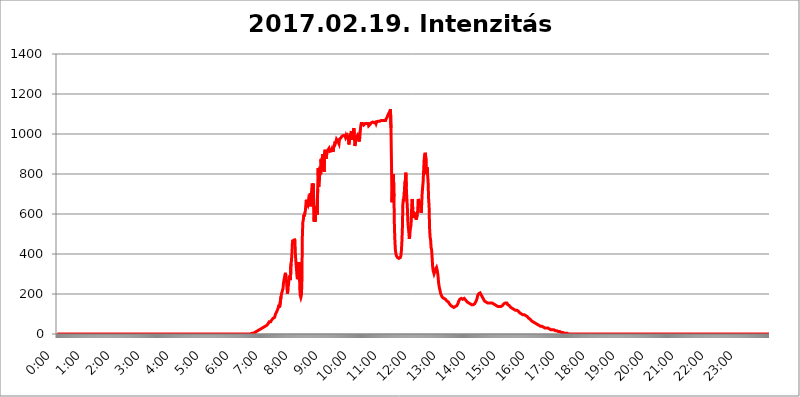
| Category | 2017.02.19. Intenzitás [W/m^2] |
|---|---|
| 0.0 | 0 |
| 0.0006944444444444445 | 0 |
| 0.001388888888888889 | 0 |
| 0.0020833333333333333 | 0 |
| 0.002777777777777778 | 0 |
| 0.003472222222222222 | 0 |
| 0.004166666666666667 | 0 |
| 0.004861111111111111 | 0 |
| 0.005555555555555556 | 0 |
| 0.0062499999999999995 | 0 |
| 0.006944444444444444 | 0 |
| 0.007638888888888889 | 0 |
| 0.008333333333333333 | 0 |
| 0.009027777777777779 | 0 |
| 0.009722222222222222 | 0 |
| 0.010416666666666666 | 0 |
| 0.011111111111111112 | 0 |
| 0.011805555555555555 | 0 |
| 0.012499999999999999 | 0 |
| 0.013194444444444444 | 0 |
| 0.013888888888888888 | 0 |
| 0.014583333333333332 | 0 |
| 0.015277777777777777 | 0 |
| 0.015972222222222224 | 0 |
| 0.016666666666666666 | 0 |
| 0.017361111111111112 | 0 |
| 0.018055555555555557 | 0 |
| 0.01875 | 0 |
| 0.019444444444444445 | 0 |
| 0.02013888888888889 | 0 |
| 0.020833333333333332 | 0 |
| 0.02152777777777778 | 0 |
| 0.022222222222222223 | 0 |
| 0.02291666666666667 | 0 |
| 0.02361111111111111 | 0 |
| 0.024305555555555556 | 0 |
| 0.024999999999999998 | 0 |
| 0.025694444444444447 | 0 |
| 0.02638888888888889 | 0 |
| 0.027083333333333334 | 0 |
| 0.027777777777777776 | 0 |
| 0.02847222222222222 | 0 |
| 0.029166666666666664 | 0 |
| 0.029861111111111113 | 0 |
| 0.030555555555555555 | 0 |
| 0.03125 | 0 |
| 0.03194444444444445 | 0 |
| 0.03263888888888889 | 0 |
| 0.03333333333333333 | 0 |
| 0.034027777777777775 | 0 |
| 0.034722222222222224 | 0 |
| 0.035416666666666666 | 0 |
| 0.036111111111111115 | 0 |
| 0.03680555555555556 | 0 |
| 0.0375 | 0 |
| 0.03819444444444444 | 0 |
| 0.03888888888888889 | 0 |
| 0.03958333333333333 | 0 |
| 0.04027777777777778 | 0 |
| 0.04097222222222222 | 0 |
| 0.041666666666666664 | 0 |
| 0.042361111111111106 | 0 |
| 0.04305555555555556 | 0 |
| 0.043750000000000004 | 0 |
| 0.044444444444444446 | 0 |
| 0.04513888888888889 | 0 |
| 0.04583333333333334 | 0 |
| 0.04652777777777778 | 0 |
| 0.04722222222222222 | 0 |
| 0.04791666666666666 | 0 |
| 0.04861111111111111 | 0 |
| 0.049305555555555554 | 0 |
| 0.049999999999999996 | 0 |
| 0.05069444444444445 | 0 |
| 0.051388888888888894 | 0 |
| 0.052083333333333336 | 0 |
| 0.05277777777777778 | 0 |
| 0.05347222222222222 | 0 |
| 0.05416666666666667 | 0 |
| 0.05486111111111111 | 0 |
| 0.05555555555555555 | 0 |
| 0.05625 | 0 |
| 0.05694444444444444 | 0 |
| 0.057638888888888885 | 0 |
| 0.05833333333333333 | 0 |
| 0.05902777777777778 | 0 |
| 0.059722222222222225 | 0 |
| 0.06041666666666667 | 0 |
| 0.061111111111111116 | 0 |
| 0.06180555555555556 | 0 |
| 0.0625 | 0 |
| 0.06319444444444444 | 0 |
| 0.06388888888888888 | 0 |
| 0.06458333333333334 | 0 |
| 0.06527777777777778 | 0 |
| 0.06597222222222222 | 0 |
| 0.06666666666666667 | 0 |
| 0.06736111111111111 | 0 |
| 0.06805555555555555 | 0 |
| 0.06874999999999999 | 0 |
| 0.06944444444444443 | 0 |
| 0.07013888888888889 | 0 |
| 0.07083333333333333 | 0 |
| 0.07152777777777779 | 0 |
| 0.07222222222222223 | 0 |
| 0.07291666666666667 | 0 |
| 0.07361111111111111 | 0 |
| 0.07430555555555556 | 0 |
| 0.075 | 0 |
| 0.07569444444444444 | 0 |
| 0.0763888888888889 | 0 |
| 0.07708333333333334 | 0 |
| 0.07777777777777778 | 0 |
| 0.07847222222222222 | 0 |
| 0.07916666666666666 | 0 |
| 0.0798611111111111 | 0 |
| 0.08055555555555556 | 0 |
| 0.08125 | 0 |
| 0.08194444444444444 | 0 |
| 0.08263888888888889 | 0 |
| 0.08333333333333333 | 0 |
| 0.08402777777777777 | 0 |
| 0.08472222222222221 | 0 |
| 0.08541666666666665 | 0 |
| 0.08611111111111112 | 0 |
| 0.08680555555555557 | 0 |
| 0.08750000000000001 | 0 |
| 0.08819444444444445 | 0 |
| 0.08888888888888889 | 0 |
| 0.08958333333333333 | 0 |
| 0.09027777777777778 | 0 |
| 0.09097222222222222 | 0 |
| 0.09166666666666667 | 0 |
| 0.09236111111111112 | 0 |
| 0.09305555555555556 | 0 |
| 0.09375 | 0 |
| 0.09444444444444444 | 0 |
| 0.09513888888888888 | 0 |
| 0.09583333333333333 | 0 |
| 0.09652777777777777 | 0 |
| 0.09722222222222222 | 0 |
| 0.09791666666666667 | 0 |
| 0.09861111111111111 | 0 |
| 0.09930555555555555 | 0 |
| 0.09999999999999999 | 0 |
| 0.10069444444444443 | 0 |
| 0.1013888888888889 | 0 |
| 0.10208333333333335 | 0 |
| 0.10277777777777779 | 0 |
| 0.10347222222222223 | 0 |
| 0.10416666666666667 | 0 |
| 0.10486111111111111 | 0 |
| 0.10555555555555556 | 0 |
| 0.10625 | 0 |
| 0.10694444444444444 | 0 |
| 0.1076388888888889 | 0 |
| 0.10833333333333334 | 0 |
| 0.10902777777777778 | 0 |
| 0.10972222222222222 | 0 |
| 0.1111111111111111 | 0 |
| 0.11180555555555556 | 0 |
| 0.11180555555555556 | 0 |
| 0.1125 | 0 |
| 0.11319444444444444 | 0 |
| 0.11388888888888889 | 0 |
| 0.11458333333333333 | 0 |
| 0.11527777777777777 | 0 |
| 0.11597222222222221 | 0 |
| 0.11666666666666665 | 0 |
| 0.1173611111111111 | 0 |
| 0.11805555555555557 | 0 |
| 0.11944444444444445 | 0 |
| 0.12013888888888889 | 0 |
| 0.12083333333333333 | 0 |
| 0.12152777777777778 | 0 |
| 0.12222222222222223 | 0 |
| 0.12291666666666667 | 0 |
| 0.12291666666666667 | 0 |
| 0.12361111111111112 | 0 |
| 0.12430555555555556 | 0 |
| 0.125 | 0 |
| 0.12569444444444444 | 0 |
| 0.12638888888888888 | 0 |
| 0.12708333333333333 | 0 |
| 0.16875 | 0 |
| 0.12847222222222224 | 0 |
| 0.12916666666666668 | 0 |
| 0.12986111111111112 | 0 |
| 0.13055555555555556 | 0 |
| 0.13125 | 0 |
| 0.13194444444444445 | 0 |
| 0.1326388888888889 | 0 |
| 0.13333333333333333 | 0 |
| 0.13402777777777777 | 0 |
| 0.13402777777777777 | 0 |
| 0.13472222222222222 | 0 |
| 0.13541666666666666 | 0 |
| 0.1361111111111111 | 0 |
| 0.13749999999999998 | 0 |
| 0.13819444444444443 | 0 |
| 0.1388888888888889 | 0 |
| 0.13958333333333334 | 0 |
| 0.14027777777777778 | 0 |
| 0.14097222222222222 | 0 |
| 0.14166666666666666 | 0 |
| 0.1423611111111111 | 0 |
| 0.14305555555555557 | 0 |
| 0.14375000000000002 | 0 |
| 0.14444444444444446 | 0 |
| 0.1451388888888889 | 0 |
| 0.1451388888888889 | 0 |
| 0.14652777777777778 | 0 |
| 0.14722222222222223 | 0 |
| 0.14791666666666667 | 0 |
| 0.1486111111111111 | 0 |
| 0.14930555555555555 | 0 |
| 0.15 | 0 |
| 0.15069444444444444 | 0 |
| 0.15138888888888888 | 0 |
| 0.15208333333333332 | 0 |
| 0.15277777777777776 | 0 |
| 0.15347222222222223 | 0 |
| 0.15416666666666667 | 0 |
| 0.15486111111111112 | 0 |
| 0.15555555555555556 | 0 |
| 0.15625 | 0 |
| 0.15694444444444444 | 0 |
| 0.15763888888888888 | 0 |
| 0.15833333333333333 | 0 |
| 0.15902777777777777 | 0 |
| 0.15972222222222224 | 0 |
| 0.16041666666666668 | 0 |
| 0.16111111111111112 | 0 |
| 0.16180555555555556 | 0 |
| 0.1625 | 0 |
| 0.16319444444444445 | 0 |
| 0.1638888888888889 | 0 |
| 0.16458333333333333 | 0 |
| 0.16527777777777777 | 0 |
| 0.16597222222222222 | 0 |
| 0.16666666666666666 | 0 |
| 0.1673611111111111 | 0 |
| 0.16805555555555554 | 0 |
| 0.16874999999999998 | 0 |
| 0.16944444444444443 | 0 |
| 0.17013888888888887 | 0 |
| 0.1708333333333333 | 0 |
| 0.17152777777777775 | 0 |
| 0.17222222222222225 | 0 |
| 0.1729166666666667 | 0 |
| 0.17361111111111113 | 0 |
| 0.17430555555555557 | 0 |
| 0.17500000000000002 | 0 |
| 0.17569444444444446 | 0 |
| 0.1763888888888889 | 0 |
| 0.17708333333333334 | 0 |
| 0.17777777777777778 | 0 |
| 0.17847222222222223 | 0 |
| 0.17916666666666667 | 0 |
| 0.1798611111111111 | 0 |
| 0.18055555555555555 | 0 |
| 0.18125 | 0 |
| 0.18194444444444444 | 0 |
| 0.1826388888888889 | 0 |
| 0.18333333333333335 | 0 |
| 0.1840277777777778 | 0 |
| 0.18472222222222223 | 0 |
| 0.18541666666666667 | 0 |
| 0.18611111111111112 | 0 |
| 0.18680555555555556 | 0 |
| 0.1875 | 0 |
| 0.18819444444444444 | 0 |
| 0.18888888888888888 | 0 |
| 0.18958333333333333 | 0 |
| 0.19027777777777777 | 0 |
| 0.1909722222222222 | 0 |
| 0.19166666666666665 | 0 |
| 0.19236111111111112 | 0 |
| 0.19305555555555554 | 0 |
| 0.19375 | 0 |
| 0.19444444444444445 | 0 |
| 0.1951388888888889 | 0 |
| 0.19583333333333333 | 0 |
| 0.19652777777777777 | 0 |
| 0.19722222222222222 | 0 |
| 0.19791666666666666 | 0 |
| 0.1986111111111111 | 0 |
| 0.19930555555555554 | 0 |
| 0.19999999999999998 | 0 |
| 0.20069444444444443 | 0 |
| 0.20138888888888887 | 0 |
| 0.2020833333333333 | 0 |
| 0.2027777777777778 | 0 |
| 0.2034722222222222 | 0 |
| 0.2041666666666667 | 0 |
| 0.20486111111111113 | 0 |
| 0.20555555555555557 | 0 |
| 0.20625000000000002 | 0 |
| 0.20694444444444446 | 0 |
| 0.2076388888888889 | 0 |
| 0.20833333333333334 | 0 |
| 0.20902777777777778 | 0 |
| 0.20972222222222223 | 0 |
| 0.21041666666666667 | 0 |
| 0.2111111111111111 | 0 |
| 0.21180555555555555 | 0 |
| 0.2125 | 0 |
| 0.21319444444444444 | 0 |
| 0.2138888888888889 | 0 |
| 0.21458333333333335 | 0 |
| 0.2152777777777778 | 0 |
| 0.21597222222222223 | 0 |
| 0.21666666666666667 | 0 |
| 0.21736111111111112 | 0 |
| 0.21805555555555556 | 0 |
| 0.21875 | 0 |
| 0.21944444444444444 | 0 |
| 0.22013888888888888 | 0 |
| 0.22083333333333333 | 0 |
| 0.22152777777777777 | 0 |
| 0.2222222222222222 | 0 |
| 0.22291666666666665 | 0 |
| 0.2236111111111111 | 0 |
| 0.22430555555555556 | 0 |
| 0.225 | 0 |
| 0.22569444444444445 | 0 |
| 0.2263888888888889 | 0 |
| 0.22708333333333333 | 0 |
| 0.22777777777777777 | 0 |
| 0.22847222222222222 | 0 |
| 0.22916666666666666 | 0 |
| 0.2298611111111111 | 0 |
| 0.23055555555555554 | 0 |
| 0.23124999999999998 | 0 |
| 0.23194444444444443 | 0 |
| 0.23263888888888887 | 0 |
| 0.2333333333333333 | 0 |
| 0.2340277777777778 | 0 |
| 0.2347222222222222 | 0 |
| 0.2354166666666667 | 0 |
| 0.23611111111111113 | 0 |
| 0.23680555555555557 | 0 |
| 0.23750000000000002 | 0 |
| 0.23819444444444446 | 0 |
| 0.2388888888888889 | 0 |
| 0.23958333333333334 | 0 |
| 0.24027777777777778 | 0 |
| 0.24097222222222223 | 0 |
| 0.24166666666666667 | 0 |
| 0.2423611111111111 | 0 |
| 0.24305555555555555 | 0 |
| 0.24375 | 0 |
| 0.24444444444444446 | 0 |
| 0.24513888888888888 | 0 |
| 0.24583333333333335 | 0 |
| 0.2465277777777778 | 0 |
| 0.24722222222222223 | 0 |
| 0.24791666666666667 | 0 |
| 0.24861111111111112 | 0 |
| 0.24930555555555556 | 0 |
| 0.25 | 0 |
| 0.25069444444444444 | 0 |
| 0.2513888888888889 | 0 |
| 0.2520833333333333 | 0 |
| 0.25277777777777777 | 0 |
| 0.2534722222222222 | 0 |
| 0.25416666666666665 | 0 |
| 0.2548611111111111 | 0 |
| 0.2555555555555556 | 0 |
| 0.25625000000000003 | 0 |
| 0.2569444444444445 | 0 |
| 0.2576388888888889 | 0 |
| 0.25833333333333336 | 0 |
| 0.2590277777777778 | 0 |
| 0.25972222222222224 | 0 |
| 0.2604166666666667 | 0 |
| 0.2611111111111111 | 0 |
| 0.26180555555555557 | 0 |
| 0.2625 | 0 |
| 0.26319444444444445 | 0 |
| 0.2638888888888889 | 0 |
| 0.26458333333333334 | 0 |
| 0.2652777777777778 | 0 |
| 0.2659722222222222 | 0 |
| 0.26666666666666666 | 0 |
| 0.2673611111111111 | 0 |
| 0.26805555555555555 | 0 |
| 0.26875 | 0 |
| 0.26944444444444443 | 0 |
| 0.2701388888888889 | 0 |
| 0.2708333333333333 | 0 |
| 0.27152777777777776 | 0 |
| 0.2722222222222222 | 3.525 |
| 0.27291666666666664 | 3.525 |
| 0.2736111111111111 | 3.525 |
| 0.2743055555555555 | 3.525 |
| 0.27499999999999997 | 3.525 |
| 0.27569444444444446 | 7.887 |
| 0.27638888888888885 | 7.887 |
| 0.27708333333333335 | 7.887 |
| 0.2777777777777778 | 7.887 |
| 0.27847222222222223 | 12.257 |
| 0.2791666666666667 | 12.257 |
| 0.2798611111111111 | 12.257 |
| 0.28055555555555556 | 16.636 |
| 0.28125 | 16.636 |
| 0.28194444444444444 | 16.636 |
| 0.2826388888888889 | 16.636 |
| 0.2833333333333333 | 21.024 |
| 0.28402777777777777 | 21.024 |
| 0.2847222222222222 | 21.024 |
| 0.28541666666666665 | 25.419 |
| 0.28611111111111115 | 25.419 |
| 0.28680555555555554 | 25.419 |
| 0.28750000000000003 | 29.823 |
| 0.2881944444444445 | 29.823 |
| 0.2888888888888889 | 29.823 |
| 0.28958333333333336 | 34.234 |
| 0.2902777777777778 | 34.234 |
| 0.29097222222222224 | 38.653 |
| 0.2916666666666667 | 38.653 |
| 0.2923611111111111 | 38.653 |
| 0.29305555555555557 | 43.079 |
| 0.29375 | 43.079 |
| 0.29444444444444445 | 47.511 |
| 0.2951388888888889 | 47.511 |
| 0.29583333333333334 | 51.951 |
| 0.2965277777777778 | 56.398 |
| 0.2972222222222222 | 60.85 |
| 0.29791666666666666 | 60.85 |
| 0.2986111111111111 | 60.85 |
| 0.29930555555555555 | 60.85 |
| 0.3 | 65.31 |
| 0.30069444444444443 | 69.775 |
| 0.3013888888888889 | 74.246 |
| 0.3020833333333333 | 74.246 |
| 0.30277777777777776 | 78.722 |
| 0.3034722222222222 | 78.722 |
| 0.30416666666666664 | 83.205 |
| 0.3048611111111111 | 83.205 |
| 0.3055555555555555 | 92.184 |
| 0.30624999999999997 | 101.184 |
| 0.3069444444444444 | 101.184 |
| 0.3076388888888889 | 110.201 |
| 0.30833333333333335 | 114.716 |
| 0.3090277777777778 | 114.716 |
| 0.30972222222222223 | 128.284 |
| 0.3104166666666667 | 137.347 |
| 0.3111111111111111 | 146.423 |
| 0.31180555555555556 | 132.814 |
| 0.3125 | 128.284 |
| 0.31319444444444444 | 137.347 |
| 0.3138888888888889 | 187.378 |
| 0.3145833333333333 | 201.058 |
| 0.31527777777777777 | 201.058 |
| 0.3159722222222222 | 201.058 |
| 0.31666666666666665 | 228.436 |
| 0.31736111111111115 | 255.813 |
| 0.31805555555555554 | 269.49 |
| 0.31875000000000003 | 283.156 |
| 0.3194444444444445 | 296.808 |
| 0.3201388888888889 | 305.898 |
| 0.32083333333333336 | 278.603 |
| 0.3215277777777778 | 269.49 |
| 0.32222222222222224 | 228.436 |
| 0.3229166666666667 | 201.058 |
| 0.3236111111111111 | 228.436 |
| 0.32430555555555557 | 246.689 |
| 0.325 | 269.49 |
| 0.32569444444444445 | 292.259 |
| 0.3263888888888889 | 278.603 |
| 0.32708333333333334 | 269.49 |
| 0.3277777777777778 | 351.198 |
| 0.3284722222222222 | 364.728 |
| 0.32916666666666666 | 405.108 |
| 0.3298611111111111 | 458.38 |
| 0.33055555555555555 | 471.582 |
| 0.33125 | 471.582 |
| 0.33194444444444443 | 445.129 |
| 0.3326388888888889 | 475.972 |
| 0.3333333333333333 | 467.187 |
| 0.3340277777777778 | 396.164 |
| 0.3347222222222222 | 360.221 |
| 0.3354166666666667 | 355.712 |
| 0.3361111111111111 | 296.808 |
| 0.3368055555555556 | 274.047 |
| 0.33749999999999997 | 278.603 |
| 0.33819444444444446 | 324.052 |
| 0.33888888888888885 | 360.221 |
| 0.33958333333333335 | 305.898 |
| 0.34027777777777773 | 219.309 |
| 0.34097222222222223 | 191.937 |
| 0.3416666666666666 | 182.82 |
| 0.3423611111111111 | 191.937 |
| 0.3430555555555555 | 246.689 |
| 0.34375 | 484.735 |
| 0.3444444444444445 | 558.261 |
| 0.3451388888888889 | 571.049 |
| 0.3458333333333334 | 596.45 |
| 0.34652777777777777 | 588.009 |
| 0.34722222222222227 | 604.864 |
| 0.34791666666666665 | 613.252 |
| 0.34861111111111115 | 642.4 |
| 0.34930555555555554 | 671.22 |
| 0.35000000000000003 | 650.667 |
| 0.3506944444444444 | 650.667 |
| 0.3513888888888889 | 642.4 |
| 0.3520833333333333 | 658.909 |
| 0.3527777777777778 | 679.395 |
| 0.3534722222222222 | 683.473 |
| 0.3541666666666667 | 671.22 |
| 0.3548611111111111 | 703.762 |
| 0.35555555555555557 | 638.256 |
| 0.35625 | 687.544 |
| 0.35694444444444445 | 723.889 |
| 0.3576388888888889 | 751.803 |
| 0.35833333333333334 | 735.89 |
| 0.3590277777777778 | 751.803 |
| 0.3597222222222222 | 755.766 |
| 0.36041666666666666 | 562.53 |
| 0.3611111111111111 | 638.256 |
| 0.36180555555555555 | 562.53 |
| 0.3625 | 625.784 |
| 0.36319444444444443 | 634.105 |
| 0.3638888888888889 | 634.105 |
| 0.3645833333333333 | 596.45 |
| 0.3652777777777778 | 723.889 |
| 0.3659722222222222 | 829.981 |
| 0.3666666666666667 | 735.89 |
| 0.3673611111111111 | 739.877 |
| 0.3680555555555556 | 795.074 |
| 0.36874999999999997 | 837.682 |
| 0.36944444444444446 | 798.974 |
| 0.37013888888888885 | 875.918 |
| 0.37083333333333335 | 837.682 |
| 0.37152777777777773 | 872.114 |
| 0.37222222222222223 | 898.668 |
| 0.3729166666666666 | 872.114 |
| 0.3736111111111111 | 818.392 |
| 0.3743055555555555 | 810.641 |
| 0.375 | 906.223 |
| 0.3756944444444445 | 921.298 |
| 0.3763888888888889 | 898.668 |
| 0.3770833333333334 | 875.918 |
| 0.37777777777777777 | 879.719 |
| 0.37847222222222227 | 913.766 |
| 0.37916666666666665 | 913.766 |
| 0.37986111111111115 | 921.298 |
| 0.38055555555555554 | 921.298 |
| 0.38125000000000003 | 928.819 |
| 0.3819444444444444 | 925.06 |
| 0.3826388888888889 | 913.766 |
| 0.3833333333333333 | 917.534 |
| 0.3840277777777778 | 909.996 |
| 0.3847222222222222 | 917.534 |
| 0.3854166666666667 | 925.06 |
| 0.3861111111111111 | 921.298 |
| 0.38680555555555557 | 909.996 |
| 0.3875 | 932.576 |
| 0.38819444444444445 | 940.082 |
| 0.3888888888888889 | 947.58 |
| 0.38958333333333334 | 962.555 |
| 0.3902777777777778 | 955.071 |
| 0.3909722222222222 | 962.555 |
| 0.39166666666666666 | 973.772 |
| 0.3923611111111111 | 970.034 |
| 0.39305555555555555 | 970.034 |
| 0.39375 | 962.555 |
| 0.39444444444444443 | 958.814 |
| 0.3951388888888889 | 951.327 |
| 0.3958333333333333 | 973.772 |
| 0.3965277777777778 | 973.772 |
| 0.3972222222222222 | 977.508 |
| 0.3979166666666667 | 981.244 |
| 0.3986111111111111 | 984.98 |
| 0.3993055555555556 | 988.714 |
| 0.39999999999999997 | 984.98 |
| 0.40069444444444446 | 992.448 |
| 0.40138888888888885 | 992.448 |
| 0.40208333333333335 | 992.448 |
| 0.40277777777777773 | 992.448 |
| 0.40347222222222223 | 992.448 |
| 0.4041666666666666 | 984.98 |
| 0.4048611111111111 | 992.448 |
| 0.4055555555555555 | 984.98 |
| 0.40625 | 984.98 |
| 0.4069444444444445 | 992.448 |
| 0.4076388888888889 | 984.98 |
| 0.4083333333333334 | 973.772 |
| 0.40902777777777777 | 947.58 |
| 0.40972222222222227 | 966.295 |
| 0.41041666666666665 | 984.98 |
| 0.41111111111111115 | 1003.65 |
| 0.41180555555555554 | 992.448 |
| 0.41250000000000003 | 1014.852 |
| 0.4131944444444444 | 992.448 |
| 0.4138888888888889 | 1014.852 |
| 0.4145833333333333 | 970.034 |
| 0.4152777777777778 | 1014.852 |
| 0.4159722222222222 | 1029.798 |
| 0.4166666666666667 | 999.916 |
| 0.4173611111111111 | 940.082 |
| 0.41805555555555557 | 943.832 |
| 0.41875 | 966.295 |
| 0.41944444444444445 | 973.772 |
| 0.4201388888888889 | 988.714 |
| 0.42083333333333334 | 988.714 |
| 0.4215277777777778 | 996.182 |
| 0.4222222222222222 | 988.714 |
| 0.42291666666666666 | 977.508 |
| 0.4236111111111111 | 962.555 |
| 0.42430555555555555 | 984.98 |
| 0.425 | 1014.852 |
| 0.42569444444444443 | 1041.019 |
| 0.4263888888888889 | 1052.255 |
| 0.4270833333333333 | 1048.508 |
| 0.4277777777777778 | 1048.508 |
| 0.4284722222222222 | 1052.255 |
| 0.4291666666666667 | 1048.508 |
| 0.4298611111111111 | 1044.762 |
| 0.4305555555555556 | 1048.508 |
| 0.43124999999999997 | 1048.508 |
| 0.43194444444444446 | 1052.255 |
| 0.43263888888888885 | 1052.255 |
| 0.43333333333333335 | 1052.255 |
| 0.43402777777777773 | 1052.255 |
| 0.43472222222222223 | 1056.004 |
| 0.4354166666666666 | 1052.255 |
| 0.4361111111111111 | 1052.255 |
| 0.4368055555555555 | 1041.019 |
| 0.4375 | 1041.019 |
| 0.4381944444444445 | 1041.019 |
| 0.4388888888888889 | 1048.508 |
| 0.4395833333333334 | 1052.255 |
| 0.44027777777777777 | 1056.004 |
| 0.44097222222222227 | 1056.004 |
| 0.44166666666666665 | 1056.004 |
| 0.44236111111111115 | 1059.756 |
| 0.44305555555555554 | 1059.756 |
| 0.44375000000000003 | 1056.004 |
| 0.4444444444444444 | 1056.004 |
| 0.4451388888888889 | 1056.004 |
| 0.4458333333333333 | 1059.756 |
| 0.4465277777777778 | 1059.756 |
| 0.4472222222222222 | 1052.255 |
| 0.4479166666666667 | 1059.756 |
| 0.4486111111111111 | 1063.51 |
| 0.44930555555555557 | 1059.756 |
| 0.45 | 1063.51 |
| 0.45069444444444445 | 1059.756 |
| 0.4513888888888889 | 1063.51 |
| 0.45208333333333334 | 1063.51 |
| 0.4527777777777778 | 1063.51 |
| 0.4534722222222222 | 1067.267 |
| 0.45416666666666666 | 1067.267 |
| 0.4548611111111111 | 1067.267 |
| 0.45555555555555555 | 1063.51 |
| 0.45625 | 1067.267 |
| 0.45694444444444443 | 1067.267 |
| 0.4576388888888889 | 1067.267 |
| 0.4583333333333333 | 1067.267 |
| 0.4590277777777778 | 1067.267 |
| 0.4597222222222222 | 1063.51 |
| 0.4604166666666667 | 1067.267 |
| 0.4611111111111111 | 1074.789 |
| 0.4618055555555556 | 1078.555 |
| 0.46249999999999997 | 1082.324 |
| 0.46319444444444446 | 1089.873 |
| 0.46388888888888885 | 1093.653 |
| 0.46458333333333335 | 1101.226 |
| 0.46527777777777773 | 1101.226 |
| 0.46597222222222223 | 1108.816 |
| 0.4666666666666666 | 1116.426 |
| 0.4673611111111111 | 1124.056 |
| 0.4680555555555555 | 1029.798 |
| 0.46875 | 864.493 |
| 0.4694444444444445 | 658.909 |
| 0.4701388888888889 | 723.889 |
| 0.4708333333333334 | 715.858 |
| 0.47152777777777777 | 798.974 |
| 0.47222222222222227 | 687.544 |
| 0.47291666666666665 | 532.513 |
| 0.47361111111111115 | 462.786 |
| 0.47430555555555554 | 418.492 |
| 0.47500000000000003 | 400.638 |
| 0.4756944444444444 | 391.685 |
| 0.4763888888888889 | 387.202 |
| 0.4770833333333333 | 382.715 |
| 0.4777777777777778 | 378.224 |
| 0.4784722222222222 | 378.224 |
| 0.4791666666666667 | 378.224 |
| 0.4798611111111111 | 378.224 |
| 0.48055555555555557 | 378.224 |
| 0.48125 | 382.715 |
| 0.48194444444444445 | 391.685 |
| 0.4826388888888889 | 414.035 |
| 0.48333333333333334 | 458.38 |
| 0.4840277777777778 | 523.88 |
| 0.4847222222222222 | 646.537 |
| 0.48541666666666666 | 675.311 |
| 0.4861111111111111 | 663.019 |
| 0.48680555555555555 | 707.8 |
| 0.4875 | 759.723 |
| 0.48819444444444443 | 767.62 |
| 0.4888888888888889 | 806.757 |
| 0.4895833333333333 | 731.896 |
| 0.4902777777777778 | 679.395 |
| 0.4909722222222222 | 638.256 |
| 0.4916666666666667 | 566.793 |
| 0.4923611111111111 | 532.513 |
| 0.4930555555555556 | 510.885 |
| 0.49374999999999997 | 475.972 |
| 0.49444444444444446 | 493.475 |
| 0.49513888888888885 | 523.88 |
| 0.49583333333333335 | 536.82 |
| 0.49652777777777773 | 566.793 |
| 0.49722222222222223 | 646.537 |
| 0.4979166666666666 | 675.311 |
| 0.4986111111111111 | 621.613 |
| 0.4993055555555555 | 592.233 |
| 0.5 | 579.542 |
| 0.5006944444444444 | 604.864 |
| 0.5013888888888889 | 600.661 |
| 0.5020833333333333 | 609.062 |
| 0.5027777777777778 | 596.45 |
| 0.5034722222222222 | 571.049 |
| 0.5041666666666667 | 566.793 |
| 0.5048611111111111 | 596.45 |
| 0.5055555555555555 | 617.436 |
| 0.50625 | 675.311 |
| 0.5069444444444444 | 671.22 |
| 0.5076388888888889 | 675.311 |
| 0.5083333333333333 | 650.667 |
| 0.5090277777777777 | 638.256 |
| 0.5097222222222222 | 646.537 |
| 0.5104166666666666 | 604.864 |
| 0.5111111111111112 | 650.667 |
| 0.5118055555555555 | 703.762 |
| 0.5125000000000001 | 707.8 |
| 0.5131944444444444 | 763.674 |
| 0.513888888888889 | 818.392 |
| 0.5145833333333333 | 872.114 |
| 0.5152777777777778 | 894.885 |
| 0.5159722222222222 | 906.223 |
| 0.5166666666666667 | 891.099 |
| 0.517361111111111 | 875.918 |
| 0.5180555555555556 | 798.974 |
| 0.5187499999999999 | 833.834 |
| 0.5194444444444445 | 795.074 |
| 0.5201388888888888 | 759.723 |
| 0.5208333333333334 | 675.311 |
| 0.5215277777777778 | 638.256 |
| 0.5222222222222223 | 528.2 |
| 0.5229166666666667 | 484.735 |
| 0.5236111111111111 | 471.582 |
| 0.5243055555555556 | 431.833 |
| 0.525 | 422.943 |
| 0.5256944444444445 | 387.202 |
| 0.5263888888888889 | 342.162 |
| 0.5270833333333333 | 319.517 |
| 0.5277777777777778 | 310.44 |
| 0.5284722222222222 | 301.354 |
| 0.5291666666666667 | 301.354 |
| 0.5298611111111111 | 305.898 |
| 0.5305555555555556 | 324.052 |
| 0.53125 | 328.584 |
| 0.5319444444444444 | 333.113 |
| 0.5326388888888889 | 324.052 |
| 0.5333333333333333 | 324.052 |
| 0.5340277777777778 | 292.259 |
| 0.5347222222222222 | 260.373 |
| 0.5354166666666667 | 242.127 |
| 0.5361111111111111 | 228.436 |
| 0.5368055555555555 | 219.309 |
| 0.5375 | 205.62 |
| 0.5381944444444444 | 201.058 |
| 0.5388888888888889 | 191.937 |
| 0.5395833333333333 | 187.378 |
| 0.5402777777777777 | 182.82 |
| 0.5409722222222222 | 182.82 |
| 0.5416666666666666 | 178.264 |
| 0.5423611111111112 | 178.264 |
| 0.5430555555555555 | 178.264 |
| 0.5437500000000001 | 173.709 |
| 0.5444444444444444 | 173.709 |
| 0.545138888888889 | 173.709 |
| 0.5458333333333333 | 169.156 |
| 0.5465277777777778 | 164.605 |
| 0.5472222222222222 | 164.605 |
| 0.5479166666666667 | 160.056 |
| 0.548611111111111 | 160.056 |
| 0.5493055555555556 | 155.509 |
| 0.5499999999999999 | 150.964 |
| 0.5506944444444445 | 146.423 |
| 0.5513888888888888 | 146.423 |
| 0.5520833333333334 | 141.884 |
| 0.5527777777777778 | 141.884 |
| 0.5534722222222223 | 137.347 |
| 0.5541666666666667 | 137.347 |
| 0.5548611111111111 | 137.347 |
| 0.5555555555555556 | 132.814 |
| 0.55625 | 132.814 |
| 0.5569444444444445 | 132.814 |
| 0.5576388888888889 | 132.814 |
| 0.5583333333333333 | 137.347 |
| 0.5590277777777778 | 137.347 |
| 0.5597222222222222 | 137.347 |
| 0.5604166666666667 | 141.884 |
| 0.5611111111111111 | 146.423 |
| 0.5618055555555556 | 150.964 |
| 0.5625 | 155.509 |
| 0.5631944444444444 | 164.605 |
| 0.5638888888888889 | 169.156 |
| 0.5645833333333333 | 173.709 |
| 0.5652777777777778 | 178.264 |
| 0.5659722222222222 | 173.709 |
| 0.5666666666666667 | 178.264 |
| 0.5673611111111111 | 178.264 |
| 0.5680555555555555 | 173.709 |
| 0.56875 | 173.709 |
| 0.5694444444444444 | 173.709 |
| 0.5701388888888889 | 173.709 |
| 0.5708333333333333 | 178.264 |
| 0.5715277777777777 | 173.709 |
| 0.5722222222222222 | 173.709 |
| 0.5729166666666666 | 169.156 |
| 0.5736111111111112 | 164.605 |
| 0.5743055555555555 | 164.605 |
| 0.5750000000000001 | 160.056 |
| 0.5756944444444444 | 160.056 |
| 0.576388888888889 | 160.056 |
| 0.5770833333333333 | 155.509 |
| 0.5777777777777778 | 155.509 |
| 0.5784722222222222 | 150.964 |
| 0.5791666666666667 | 150.964 |
| 0.579861111111111 | 146.423 |
| 0.5805555555555556 | 146.423 |
| 0.5812499999999999 | 146.423 |
| 0.5819444444444445 | 146.423 |
| 0.5826388888888888 | 146.423 |
| 0.5833333333333334 | 146.423 |
| 0.5840277777777778 | 146.423 |
| 0.5847222222222223 | 146.423 |
| 0.5854166666666667 | 150.964 |
| 0.5861111111111111 | 155.509 |
| 0.5868055555555556 | 155.509 |
| 0.5875 | 164.605 |
| 0.5881944444444445 | 169.156 |
| 0.5888888888888889 | 178.264 |
| 0.5895833333333333 | 191.937 |
| 0.5902777777777778 | 196.497 |
| 0.5909722222222222 | 201.058 |
| 0.5916666666666667 | 201.058 |
| 0.5923611111111111 | 201.058 |
| 0.5930555555555556 | 205.62 |
| 0.59375 | 201.058 |
| 0.5944444444444444 | 196.497 |
| 0.5951388888888889 | 191.937 |
| 0.5958333333333333 | 187.378 |
| 0.5965277777777778 | 187.378 |
| 0.5972222222222222 | 182.82 |
| 0.5979166666666667 | 173.709 |
| 0.5986111111111111 | 169.156 |
| 0.5993055555555555 | 164.605 |
| 0.6 | 164.605 |
| 0.6006944444444444 | 164.605 |
| 0.6013888888888889 | 160.056 |
| 0.6020833333333333 | 160.056 |
| 0.6027777777777777 | 160.056 |
| 0.6034722222222222 | 155.509 |
| 0.6041666666666666 | 155.509 |
| 0.6048611111111112 | 155.509 |
| 0.6055555555555555 | 155.509 |
| 0.6062500000000001 | 155.509 |
| 0.6069444444444444 | 155.509 |
| 0.607638888888889 | 155.509 |
| 0.6083333333333333 | 155.509 |
| 0.6090277777777778 | 155.509 |
| 0.6097222222222222 | 155.509 |
| 0.6104166666666667 | 150.964 |
| 0.611111111111111 | 150.964 |
| 0.6118055555555556 | 150.964 |
| 0.6124999999999999 | 146.423 |
| 0.6131944444444445 | 146.423 |
| 0.6138888888888888 | 146.423 |
| 0.6145833333333334 | 146.423 |
| 0.6152777777777778 | 141.884 |
| 0.6159722222222223 | 141.884 |
| 0.6166666666666667 | 137.347 |
| 0.6173611111111111 | 137.347 |
| 0.6180555555555556 | 137.347 |
| 0.61875 | 137.347 |
| 0.6194444444444445 | 137.347 |
| 0.6201388888888889 | 137.347 |
| 0.6208333333333333 | 137.347 |
| 0.6215277777777778 | 137.347 |
| 0.6222222222222222 | 137.347 |
| 0.6229166666666667 | 137.347 |
| 0.6236111111111111 | 137.347 |
| 0.6243055555555556 | 141.884 |
| 0.625 | 146.423 |
| 0.6256944444444444 | 146.423 |
| 0.6263888888888889 | 150.964 |
| 0.6270833333333333 | 150.964 |
| 0.6277777777777778 | 155.509 |
| 0.6284722222222222 | 155.509 |
| 0.6291666666666667 | 155.509 |
| 0.6298611111111111 | 155.509 |
| 0.6305555555555555 | 155.509 |
| 0.63125 | 150.964 |
| 0.6319444444444444 | 146.423 |
| 0.6326388888888889 | 146.423 |
| 0.6333333333333333 | 141.884 |
| 0.6340277777777777 | 141.884 |
| 0.6347222222222222 | 137.347 |
| 0.6354166666666666 | 137.347 |
| 0.6361111111111112 | 132.814 |
| 0.6368055555555555 | 132.814 |
| 0.6375000000000001 | 128.284 |
| 0.6381944444444444 | 128.284 |
| 0.638888888888889 | 123.758 |
| 0.6395833333333333 | 123.758 |
| 0.6402777777777778 | 123.758 |
| 0.6409722222222222 | 123.758 |
| 0.6416666666666667 | 119.235 |
| 0.642361111111111 | 119.235 |
| 0.6430555555555556 | 119.235 |
| 0.6437499999999999 | 119.235 |
| 0.6444444444444445 | 119.235 |
| 0.6451388888888888 | 119.235 |
| 0.6458333333333334 | 114.716 |
| 0.6465277777777778 | 114.716 |
| 0.6472222222222223 | 110.201 |
| 0.6479166666666667 | 110.201 |
| 0.6486111111111111 | 105.69 |
| 0.6493055555555556 | 105.69 |
| 0.65 | 101.184 |
| 0.6506944444444445 | 101.184 |
| 0.6513888888888889 | 101.184 |
| 0.6520833333333333 | 96.682 |
| 0.6527777777777778 | 96.682 |
| 0.6534722222222222 | 96.682 |
| 0.6541666666666667 | 96.682 |
| 0.6548611111111111 | 96.682 |
| 0.6555555555555556 | 92.184 |
| 0.65625 | 92.184 |
| 0.6569444444444444 | 92.184 |
| 0.6576388888888889 | 92.184 |
| 0.6583333333333333 | 92.184 |
| 0.6590277777777778 | 87.692 |
| 0.6597222222222222 | 87.692 |
| 0.6604166666666667 | 83.205 |
| 0.6611111111111111 | 78.722 |
| 0.6618055555555555 | 78.722 |
| 0.6625 | 74.246 |
| 0.6631944444444444 | 74.246 |
| 0.6638888888888889 | 69.775 |
| 0.6645833333333333 | 69.775 |
| 0.6652777777777777 | 65.31 |
| 0.6659722222222222 | 65.31 |
| 0.6666666666666666 | 65.31 |
| 0.6673611111111111 | 60.85 |
| 0.6680555555555556 | 60.85 |
| 0.6687500000000001 | 56.398 |
| 0.6694444444444444 | 56.398 |
| 0.6701388888888888 | 56.398 |
| 0.6708333333333334 | 51.951 |
| 0.6715277777777778 | 51.951 |
| 0.6722222222222222 | 47.511 |
| 0.6729166666666666 | 47.511 |
| 0.6736111111111112 | 47.511 |
| 0.6743055555555556 | 43.079 |
| 0.6749999999999999 | 43.079 |
| 0.6756944444444444 | 43.079 |
| 0.6763888888888889 | 38.653 |
| 0.6770833333333334 | 38.653 |
| 0.6777777777777777 | 38.653 |
| 0.6784722222222223 | 38.653 |
| 0.6791666666666667 | 38.653 |
| 0.6798611111111111 | 38.653 |
| 0.6805555555555555 | 34.234 |
| 0.68125 | 34.234 |
| 0.6819444444444445 | 34.234 |
| 0.6826388888888889 | 34.234 |
| 0.6833333333333332 | 34.234 |
| 0.6840277777777778 | 29.823 |
| 0.6847222222222222 | 29.823 |
| 0.6854166666666667 | 29.823 |
| 0.686111111111111 | 29.823 |
| 0.6868055555555556 | 29.823 |
| 0.6875 | 29.823 |
| 0.6881944444444444 | 29.823 |
| 0.688888888888889 | 25.419 |
| 0.6895833333333333 | 25.419 |
| 0.6902777777777778 | 25.419 |
| 0.6909722222222222 | 25.419 |
| 0.6916666666666668 | 25.419 |
| 0.6923611111111111 | 21.024 |
| 0.6930555555555555 | 21.024 |
| 0.69375 | 21.024 |
| 0.6944444444444445 | 21.024 |
| 0.6951388888888889 | 21.024 |
| 0.6958333333333333 | 21.024 |
| 0.6965277777777777 | 21.024 |
| 0.6972222222222223 | 16.636 |
| 0.6979166666666666 | 16.636 |
| 0.6986111111111111 | 16.636 |
| 0.6993055555555556 | 16.636 |
| 0.7000000000000001 | 16.636 |
| 0.7006944444444444 | 16.636 |
| 0.7013888888888888 | 12.257 |
| 0.7020833333333334 | 12.257 |
| 0.7027777777777778 | 12.257 |
| 0.7034722222222222 | 12.257 |
| 0.7041666666666666 | 12.257 |
| 0.7048611111111112 | 12.257 |
| 0.7055555555555556 | 12.257 |
| 0.7062499999999999 | 7.887 |
| 0.7069444444444444 | 7.887 |
| 0.7076388888888889 | 7.887 |
| 0.7083333333333334 | 7.887 |
| 0.7090277777777777 | 7.887 |
| 0.7097222222222223 | 3.525 |
| 0.7104166666666667 | 3.525 |
| 0.7111111111111111 | 3.525 |
| 0.7118055555555555 | 3.525 |
| 0.7125 | 3.525 |
| 0.7131944444444445 | 3.525 |
| 0.7138888888888889 | 3.525 |
| 0.7145833333333332 | 3.525 |
| 0.7152777777777778 | 3.525 |
| 0.7159722222222222 | 3.525 |
| 0.7166666666666667 | 0 |
| 0.717361111111111 | 0 |
| 0.7180555555555556 | 0 |
| 0.71875 | 0 |
| 0.7194444444444444 | 0 |
| 0.720138888888889 | 0 |
| 0.7208333333333333 | 0 |
| 0.7215277777777778 | 0 |
| 0.7222222222222222 | 0 |
| 0.7229166666666668 | 0 |
| 0.7236111111111111 | 0 |
| 0.7243055555555555 | 0 |
| 0.725 | 0 |
| 0.7256944444444445 | 0 |
| 0.7263888888888889 | 0 |
| 0.7270833333333333 | 0 |
| 0.7277777777777777 | 0 |
| 0.7284722222222223 | 0 |
| 0.7291666666666666 | 0 |
| 0.7298611111111111 | 0 |
| 0.7305555555555556 | 0 |
| 0.7312500000000001 | 0 |
| 0.7319444444444444 | 0 |
| 0.7326388888888888 | 0 |
| 0.7333333333333334 | 0 |
| 0.7340277777777778 | 0 |
| 0.7347222222222222 | 0 |
| 0.7354166666666666 | 0 |
| 0.7361111111111112 | 0 |
| 0.7368055555555556 | 0 |
| 0.7374999999999999 | 0 |
| 0.7381944444444444 | 0 |
| 0.7388888888888889 | 0 |
| 0.7395833333333334 | 0 |
| 0.7402777777777777 | 0 |
| 0.7409722222222223 | 0 |
| 0.7416666666666667 | 0 |
| 0.7423611111111111 | 0 |
| 0.7430555555555555 | 0 |
| 0.74375 | 0 |
| 0.7444444444444445 | 0 |
| 0.7451388888888889 | 0 |
| 0.7458333333333332 | 0 |
| 0.7465277777777778 | 0 |
| 0.7472222222222222 | 0 |
| 0.7479166666666667 | 0 |
| 0.748611111111111 | 0 |
| 0.7493055555555556 | 0 |
| 0.75 | 0 |
| 0.7506944444444444 | 0 |
| 0.751388888888889 | 0 |
| 0.7520833333333333 | 0 |
| 0.7527777777777778 | 0 |
| 0.7534722222222222 | 0 |
| 0.7541666666666668 | 0 |
| 0.7548611111111111 | 0 |
| 0.7555555555555555 | 0 |
| 0.75625 | 0 |
| 0.7569444444444445 | 0 |
| 0.7576388888888889 | 0 |
| 0.7583333333333333 | 0 |
| 0.7590277777777777 | 0 |
| 0.7597222222222223 | 0 |
| 0.7604166666666666 | 0 |
| 0.7611111111111111 | 0 |
| 0.7618055555555556 | 0 |
| 0.7625000000000001 | 0 |
| 0.7631944444444444 | 0 |
| 0.7638888888888888 | 0 |
| 0.7645833333333334 | 0 |
| 0.7652777777777778 | 0 |
| 0.7659722222222222 | 0 |
| 0.7666666666666666 | 0 |
| 0.7673611111111112 | 0 |
| 0.7680555555555556 | 0 |
| 0.7687499999999999 | 0 |
| 0.7694444444444444 | 0 |
| 0.7701388888888889 | 0 |
| 0.7708333333333334 | 0 |
| 0.7715277777777777 | 0 |
| 0.7722222222222223 | 0 |
| 0.7729166666666667 | 0 |
| 0.7736111111111111 | 0 |
| 0.7743055555555555 | 0 |
| 0.775 | 0 |
| 0.7756944444444445 | 0 |
| 0.7763888888888889 | 0 |
| 0.7770833333333332 | 0 |
| 0.7777777777777778 | 0 |
| 0.7784722222222222 | 0 |
| 0.7791666666666667 | 0 |
| 0.779861111111111 | 0 |
| 0.7805555555555556 | 0 |
| 0.78125 | 0 |
| 0.7819444444444444 | 0 |
| 0.782638888888889 | 0 |
| 0.7833333333333333 | 0 |
| 0.7840277777777778 | 0 |
| 0.7847222222222222 | 0 |
| 0.7854166666666668 | 0 |
| 0.7861111111111111 | 0 |
| 0.7868055555555555 | 0 |
| 0.7875 | 0 |
| 0.7881944444444445 | 0 |
| 0.7888888888888889 | 0 |
| 0.7895833333333333 | 0 |
| 0.7902777777777777 | 0 |
| 0.7909722222222223 | 0 |
| 0.7916666666666666 | 0 |
| 0.7923611111111111 | 0 |
| 0.7930555555555556 | 0 |
| 0.7937500000000001 | 0 |
| 0.7944444444444444 | 0 |
| 0.7951388888888888 | 0 |
| 0.7958333333333334 | 0 |
| 0.7965277777777778 | 0 |
| 0.7972222222222222 | 0 |
| 0.7979166666666666 | 0 |
| 0.7986111111111112 | 0 |
| 0.7993055555555556 | 0 |
| 0.7999999999999999 | 0 |
| 0.8006944444444444 | 0 |
| 0.8013888888888889 | 0 |
| 0.8020833333333334 | 0 |
| 0.8027777777777777 | 0 |
| 0.8034722222222223 | 0 |
| 0.8041666666666667 | 0 |
| 0.8048611111111111 | 0 |
| 0.8055555555555555 | 0 |
| 0.80625 | 0 |
| 0.8069444444444445 | 0 |
| 0.8076388888888889 | 0 |
| 0.8083333333333332 | 0 |
| 0.8090277777777778 | 0 |
| 0.8097222222222222 | 0 |
| 0.8104166666666667 | 0 |
| 0.811111111111111 | 0 |
| 0.8118055555555556 | 0 |
| 0.8125 | 0 |
| 0.8131944444444444 | 0 |
| 0.813888888888889 | 0 |
| 0.8145833333333333 | 0 |
| 0.8152777777777778 | 0 |
| 0.8159722222222222 | 0 |
| 0.8166666666666668 | 0 |
| 0.8173611111111111 | 0 |
| 0.8180555555555555 | 0 |
| 0.81875 | 0 |
| 0.8194444444444445 | 0 |
| 0.8201388888888889 | 0 |
| 0.8208333333333333 | 0 |
| 0.8215277777777777 | 0 |
| 0.8222222222222223 | 0 |
| 0.8229166666666666 | 0 |
| 0.8236111111111111 | 0 |
| 0.8243055555555556 | 0 |
| 0.8250000000000001 | 0 |
| 0.8256944444444444 | 0 |
| 0.8263888888888888 | 0 |
| 0.8270833333333334 | 0 |
| 0.8277777777777778 | 0 |
| 0.8284722222222222 | 0 |
| 0.8291666666666666 | 0 |
| 0.8298611111111112 | 0 |
| 0.8305555555555556 | 0 |
| 0.8312499999999999 | 0 |
| 0.8319444444444444 | 0 |
| 0.8326388888888889 | 0 |
| 0.8333333333333334 | 0 |
| 0.8340277777777777 | 0 |
| 0.8347222222222223 | 0 |
| 0.8354166666666667 | 0 |
| 0.8361111111111111 | 0 |
| 0.8368055555555555 | 0 |
| 0.8375 | 0 |
| 0.8381944444444445 | 0 |
| 0.8388888888888889 | 0 |
| 0.8395833333333332 | 0 |
| 0.8402777777777778 | 0 |
| 0.8409722222222222 | 0 |
| 0.8416666666666667 | 0 |
| 0.842361111111111 | 0 |
| 0.8430555555555556 | 0 |
| 0.84375 | 0 |
| 0.8444444444444444 | 0 |
| 0.845138888888889 | 0 |
| 0.8458333333333333 | 0 |
| 0.8465277777777778 | 0 |
| 0.8472222222222222 | 0 |
| 0.8479166666666668 | 0 |
| 0.8486111111111111 | 0 |
| 0.8493055555555555 | 0 |
| 0.85 | 0 |
| 0.8506944444444445 | 0 |
| 0.8513888888888889 | 0 |
| 0.8520833333333333 | 0 |
| 0.8527777777777777 | 0 |
| 0.8534722222222223 | 0 |
| 0.8541666666666666 | 0 |
| 0.8548611111111111 | 0 |
| 0.8555555555555556 | 0 |
| 0.8562500000000001 | 0 |
| 0.8569444444444444 | 0 |
| 0.8576388888888888 | 0 |
| 0.8583333333333334 | 0 |
| 0.8590277777777778 | 0 |
| 0.8597222222222222 | 0 |
| 0.8604166666666666 | 0 |
| 0.8611111111111112 | 0 |
| 0.8618055555555556 | 0 |
| 0.8624999999999999 | 0 |
| 0.8631944444444444 | 0 |
| 0.8638888888888889 | 0 |
| 0.8645833333333334 | 0 |
| 0.8652777777777777 | 0 |
| 0.8659722222222223 | 0 |
| 0.8666666666666667 | 0 |
| 0.8673611111111111 | 0 |
| 0.8680555555555555 | 0 |
| 0.86875 | 0 |
| 0.8694444444444445 | 0 |
| 0.8701388888888889 | 0 |
| 0.8708333333333332 | 0 |
| 0.8715277777777778 | 0 |
| 0.8722222222222222 | 0 |
| 0.8729166666666667 | 0 |
| 0.873611111111111 | 0 |
| 0.8743055555555556 | 0 |
| 0.875 | 0 |
| 0.8756944444444444 | 0 |
| 0.876388888888889 | 0 |
| 0.8770833333333333 | 0 |
| 0.8777777777777778 | 0 |
| 0.8784722222222222 | 0 |
| 0.8791666666666668 | 0 |
| 0.8798611111111111 | 0 |
| 0.8805555555555555 | 0 |
| 0.88125 | 0 |
| 0.8819444444444445 | 0 |
| 0.8826388888888889 | 0 |
| 0.8833333333333333 | 0 |
| 0.8840277777777777 | 0 |
| 0.8847222222222223 | 0 |
| 0.8854166666666666 | 0 |
| 0.8861111111111111 | 0 |
| 0.8868055555555556 | 0 |
| 0.8875000000000001 | 0 |
| 0.8881944444444444 | 0 |
| 0.8888888888888888 | 0 |
| 0.8895833333333334 | 0 |
| 0.8902777777777778 | 0 |
| 0.8909722222222222 | 0 |
| 0.8916666666666666 | 0 |
| 0.8923611111111112 | 0 |
| 0.8930555555555556 | 0 |
| 0.8937499999999999 | 0 |
| 0.8944444444444444 | 0 |
| 0.8951388888888889 | 0 |
| 0.8958333333333334 | 0 |
| 0.8965277777777777 | 0 |
| 0.8972222222222223 | 0 |
| 0.8979166666666667 | 0 |
| 0.8986111111111111 | 0 |
| 0.8993055555555555 | 0 |
| 0.9 | 0 |
| 0.9006944444444445 | 0 |
| 0.9013888888888889 | 0 |
| 0.9020833333333332 | 0 |
| 0.9027777777777778 | 0 |
| 0.9034722222222222 | 0 |
| 0.9041666666666667 | 0 |
| 0.904861111111111 | 0 |
| 0.9055555555555556 | 0 |
| 0.90625 | 0 |
| 0.9069444444444444 | 0 |
| 0.907638888888889 | 0 |
| 0.9083333333333333 | 0 |
| 0.9090277777777778 | 0 |
| 0.9097222222222222 | 0 |
| 0.9104166666666668 | 0 |
| 0.9111111111111111 | 0 |
| 0.9118055555555555 | 0 |
| 0.9125 | 0 |
| 0.9131944444444445 | 0 |
| 0.9138888888888889 | 0 |
| 0.9145833333333333 | 0 |
| 0.9152777777777777 | 0 |
| 0.9159722222222223 | 0 |
| 0.9166666666666666 | 0 |
| 0.9173611111111111 | 0 |
| 0.9180555555555556 | 0 |
| 0.9187500000000001 | 0 |
| 0.9194444444444444 | 0 |
| 0.9201388888888888 | 0 |
| 0.9208333333333334 | 0 |
| 0.9215277777777778 | 0 |
| 0.9222222222222222 | 0 |
| 0.9229166666666666 | 0 |
| 0.9236111111111112 | 0 |
| 0.9243055555555556 | 0 |
| 0.9249999999999999 | 0 |
| 0.9256944444444444 | 0 |
| 0.9263888888888889 | 0 |
| 0.9270833333333334 | 0 |
| 0.9277777777777777 | 0 |
| 0.9284722222222223 | 0 |
| 0.9291666666666667 | 0 |
| 0.9298611111111111 | 0 |
| 0.9305555555555555 | 0 |
| 0.93125 | 0 |
| 0.9319444444444445 | 0 |
| 0.9326388888888889 | 0 |
| 0.9333333333333332 | 0 |
| 0.9340277777777778 | 0 |
| 0.9347222222222222 | 0 |
| 0.9354166666666667 | 0 |
| 0.936111111111111 | 0 |
| 0.9368055555555556 | 0 |
| 0.9375 | 0 |
| 0.9381944444444444 | 0 |
| 0.938888888888889 | 0 |
| 0.9395833333333333 | 0 |
| 0.9402777777777778 | 0 |
| 0.9409722222222222 | 0 |
| 0.9416666666666668 | 0 |
| 0.9423611111111111 | 0 |
| 0.9430555555555555 | 0 |
| 0.94375 | 0 |
| 0.9444444444444445 | 0 |
| 0.9451388888888889 | 0 |
| 0.9458333333333333 | 0 |
| 0.9465277777777777 | 0 |
| 0.9472222222222223 | 0 |
| 0.9479166666666666 | 0 |
| 0.9486111111111111 | 0 |
| 0.9493055555555556 | 0 |
| 0.9500000000000001 | 0 |
| 0.9506944444444444 | 0 |
| 0.9513888888888888 | 0 |
| 0.9520833333333334 | 0 |
| 0.9527777777777778 | 0 |
| 0.9534722222222222 | 0 |
| 0.9541666666666666 | 0 |
| 0.9548611111111112 | 0 |
| 0.9555555555555556 | 0 |
| 0.9562499999999999 | 0 |
| 0.9569444444444444 | 0 |
| 0.9576388888888889 | 0 |
| 0.9583333333333334 | 0 |
| 0.9590277777777777 | 0 |
| 0.9597222222222223 | 0 |
| 0.9604166666666667 | 0 |
| 0.9611111111111111 | 0 |
| 0.9618055555555555 | 0 |
| 0.9625 | 0 |
| 0.9631944444444445 | 0 |
| 0.9638888888888889 | 0 |
| 0.9645833333333332 | 0 |
| 0.9652777777777778 | 0 |
| 0.9659722222222222 | 0 |
| 0.9666666666666667 | 0 |
| 0.967361111111111 | 0 |
| 0.9680555555555556 | 0 |
| 0.96875 | 0 |
| 0.9694444444444444 | 0 |
| 0.970138888888889 | 0 |
| 0.9708333333333333 | 0 |
| 0.9715277777777778 | 0 |
| 0.9722222222222222 | 0 |
| 0.9729166666666668 | 0 |
| 0.9736111111111111 | 0 |
| 0.9743055555555555 | 0 |
| 0.975 | 0 |
| 0.9756944444444445 | 0 |
| 0.9763888888888889 | 0 |
| 0.9770833333333333 | 0 |
| 0.9777777777777777 | 0 |
| 0.9784722222222223 | 0 |
| 0.9791666666666666 | 0 |
| 0.9798611111111111 | 0 |
| 0.9805555555555556 | 0 |
| 0.9812500000000001 | 0 |
| 0.9819444444444444 | 0 |
| 0.9826388888888888 | 0 |
| 0.9833333333333334 | 0 |
| 0.9840277777777778 | 0 |
| 0.9847222222222222 | 0 |
| 0.9854166666666666 | 0 |
| 0.9861111111111112 | 0 |
| 0.9868055555555556 | 0 |
| 0.9874999999999999 | 0 |
| 0.9881944444444444 | 0 |
| 0.9888888888888889 | 0 |
| 0.9895833333333334 | 0 |
| 0.9902777777777777 | 0 |
| 0.9909722222222223 | 0 |
| 0.9916666666666667 | 0 |
| 0.9923611111111111 | 0 |
| 0.9930555555555555 | 0 |
| 0.99375 | 0 |
| 0.9944444444444445 | 0 |
| 0.9951388888888889 | 0 |
| 0.9958333333333332 | 0 |
| 0.9965277777777778 | 0 |
| 0.9972222222222222 | 0 |
| 0.9979166666666667 | 0 |
| 0.998611111111111 | 0 |
| 0.9993055555555556 | 0 |